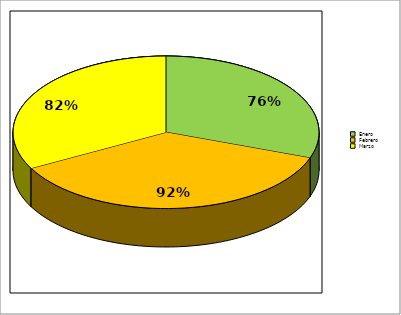
| Category | Series 0 |
|---|---|
| Enero  | 0.765 |
| Febrero  | 0.921 |
| Marzo  | 0.824 |